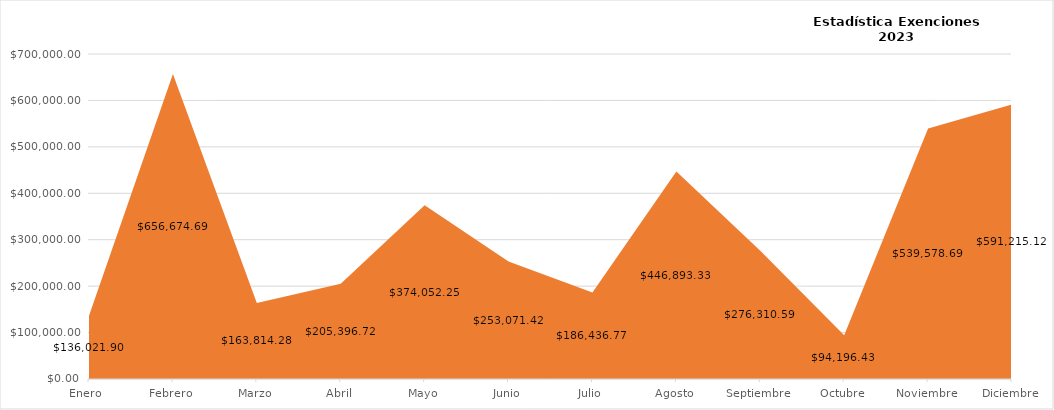
| Category | Total de Monto Condonado |
|---|---|
| Enero  | 136021.9 |
| Febrero | 656674.69 |
| Marzo | 163814.28 |
| Abril | 205396.72 |
| Mayo | 374052.25 |
| Junio | 253071.42 |
| Julio | 186436.77 |
| Agosto | 446893.33 |
| Septiembre | 276310.59 |
| Octubre | 94196.43 |
| Noviembre | 539578.69 |
| Diciembre | 591215.12 |